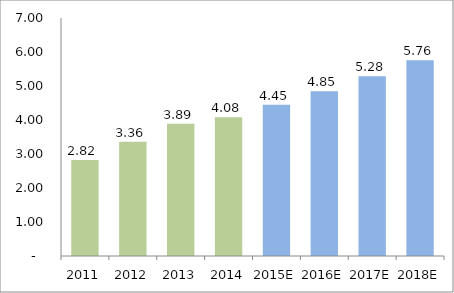
| Category | EPS |
|---|---|
| 2011 | 2.82 |
| 2012 | 3.36 |
| 2013 | 3.89 |
| 2014 | 4.08 |
| 2015E | 4.447 |
| 2016E | 4.847 |
| 2017E | 5.284 |
| 2018E | 5.759 |